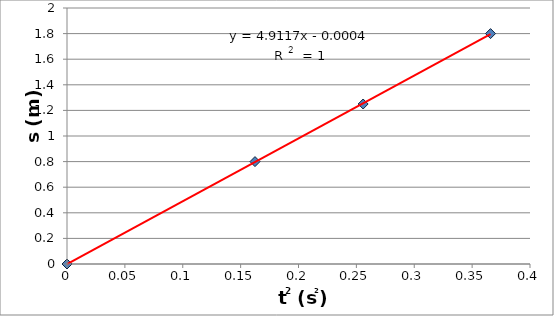
| Category | Series 0 |
|---|---|
| 0.0 | 0 |
| 0.36590401 | 1.8 |
| 0.25583364000000003 | 1.25 |
| 0.16240900000000003 | 0.8 |